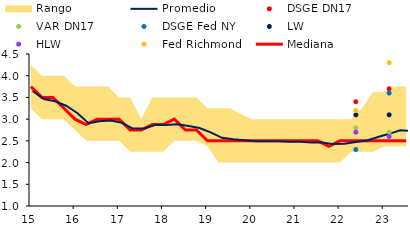
| Category | Mediana |
|---|---|
| 2015-06-30 | 3.75 |
| 2015-09-30 | 3.5 |
| 2015-12-31 | 3.5 |
| 2016-03-31 | 3.25 |
| 2016-06-30 | 3 |
| 2016-09-30 | 2.875 |
| 2016-12-30 | 3 |
| 2017-03-31 | 3 |
| 2017-06-30 | 3 |
| 2017-09-29 | 2.75 |
| 2017-12-29 | 2.75 |
| 2018-03-30 | 2.875 |
| 2018-06-29 | 2.875 |
| 2018-09-28 | 3 |
| 2018-12-31 | 2.75 |
| 2019-03-29 | 2.75 |
| 2019-06-28 | 2.5 |
| 2019-09-30 | 2.5 |
| 2019-12-31 | 2.5 |
| 2020-06-30 | 2.5 |
| 2020-09-30 | 2.5 |
| 2020-12-31 | 2.5 |
| 2021-03-31 | 2.5 |
| 2021-06-30 | 2.5 |
| 2021-09-30 | 2.5 |
| 2021-12-31 | 2.5 |
| 2022-03-31 | 2.375 |
| 2022-06-30 | 2.5 |
| 2022-09-30 | 2.5 |
| 2022-12-30 | 2.5 |
| 2023-03-31 | 2.5 |
| 2023-06-30 | 2.5 |
| 2023-09-29 | 2.5 |
| 2023-12-29 | 2.5 |